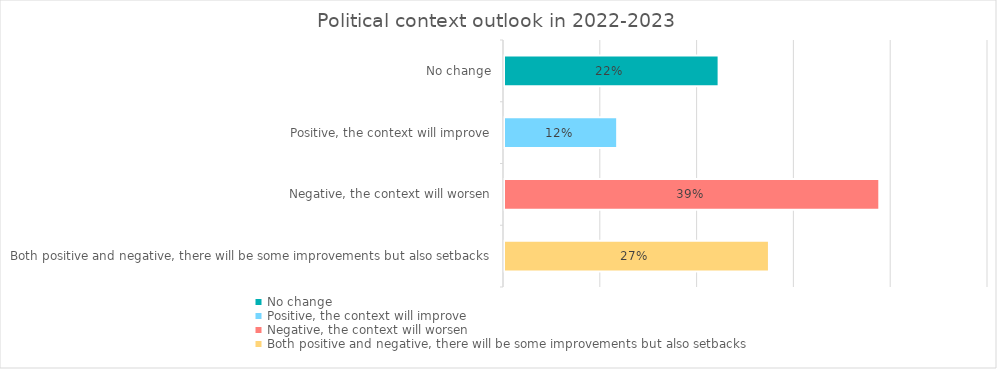
| Category | Series 0 |
|---|---|
| No change | 0.222 |
| Positive, the context will improve | 0.117 |
| Negative, the context will worsen | 0.388 |
| Both positive and negative, there will be some improvements but also setbacks | 0.274 |